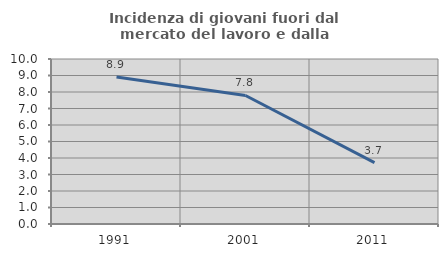
| Category | Incidenza di giovani fuori dal mercato del lavoro e dalla formazione  |
|---|---|
| 1991.0 | 8.912 |
| 2001.0 | 7.789 |
| 2011.0 | 3.717 |